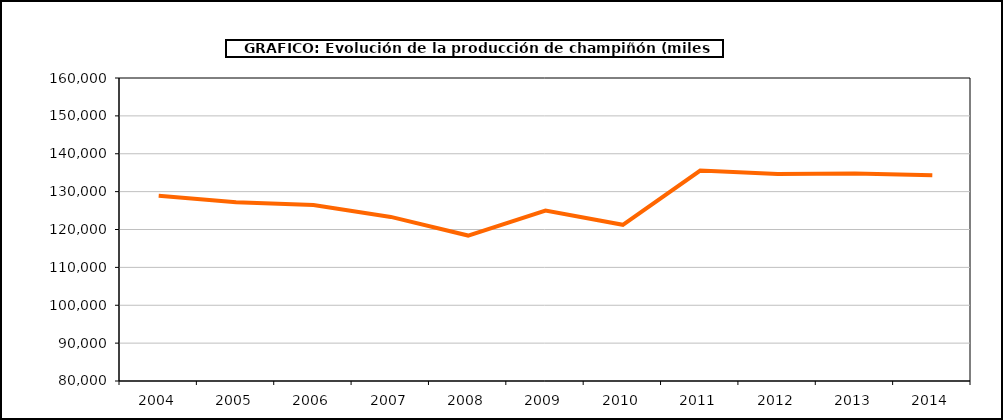
| Category | producción |
|---|---|
| 2004.0 | 128898 |
| 2005.0 | 127213 |
| 2006.0 | 126463 |
| 2007.0 | 123322 |
| 2008.0 | 118398 |
| 2009.0 | 125017 |
| 2010.0 | 121248 |
| 2011.0 | 135545 |
| 2012.0 | 134676 |
| 2013.0 | 134768 |
| 2014.0 | 134317 |